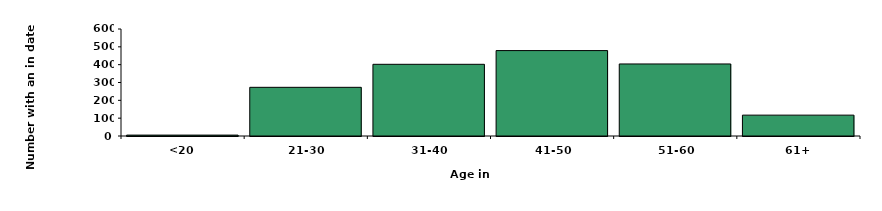
| Category | Series 0 |
|---|---|
| <20 | 5 |
| 21-30 | 273 |
| 31-40 | 402 |
| 41-50 | 479 |
| 51-60 | 404 |
| 61+ | 117 |